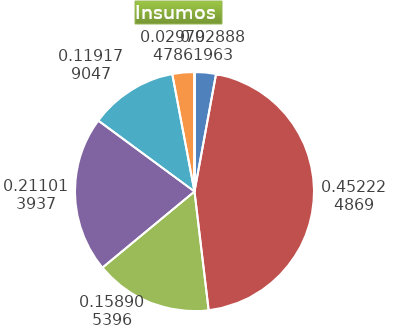
| Category | Series 0 |
|---|---|
| Control arvenses | 265620 |
| Control fitosanitario | 4158996 |
| Cosecha y beneficio | 1461412.129 |
| Fertilización | 1940641 |
| Instalación | 1096059.096 |
| Otros | 274015 |
| Podas | 0 |
| Riego | 0 |
| Transporte | 0 |
| Tutorado | 0 |